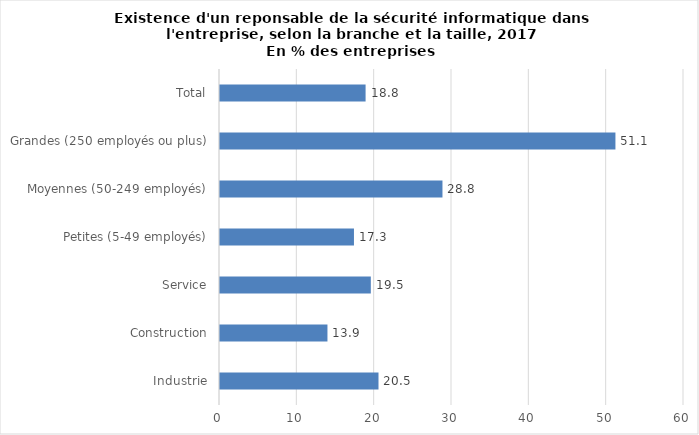
| Category | Series 0 |
|---|---|
| Industrie | 20.495 |
| Construction | 13.895 |
| Service | 19.502 |
| Petites (5-49 employés) | 17.323 |
| Moyennes (50-249 employés) | 28.767 |
| Grandes (250 employés ou plus) | 51.134 |
| Total | 18.826 |